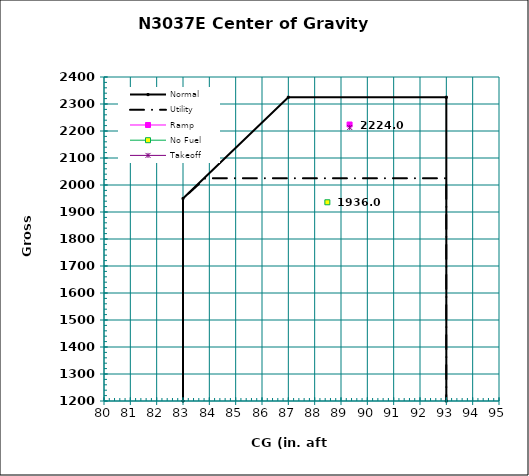
| Category | Normal |
|---|---|
| 83.0 | 1200 |
| 83.0 | 1950 |
| 87.0 | 2325 |
| 93.0 | 2325 |
| 93.0 | 1200 |